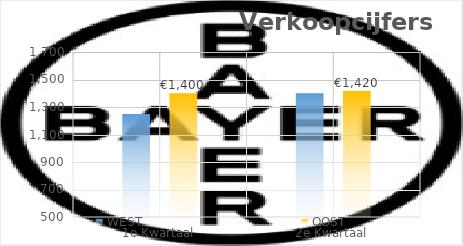
| Category | WEST | OOST |
|---|---|---|
| 1e Kwartaal | 1250 | 1400 |
| 2e Kwartaal | 1400 | 1420 |